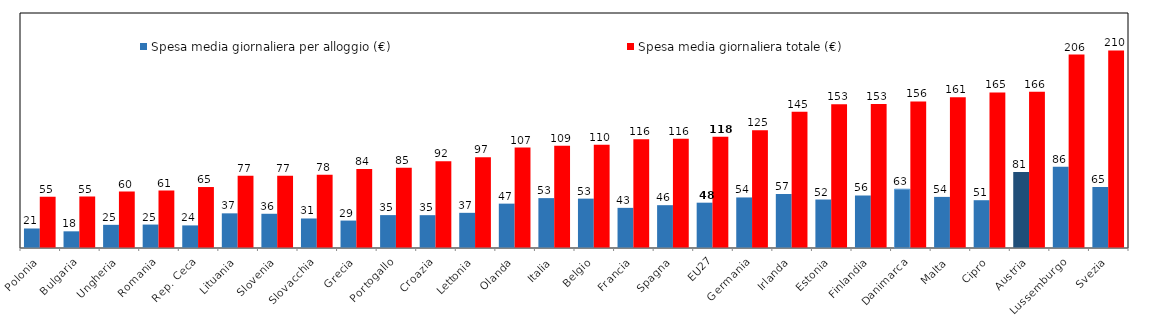
| Category | Spesa media giornaliera per alloggio (€) | Spesa media giornaliera totale (€) |
|---|---|---|
| Polonia | 20.76 | 54.585 |
| Bulgaria | 17.74 | 54.769 |
| Ungheria | 24.64 | 60.042 |
| Romania | 24.93 | 61.157 |
| Rep. Ceca | 24.04 | 64.861 |
| Lituania | 36.87 | 76.853 |
| Slovenia | 36.41 | 76.895 |
| Slovacchia | 31.41 | 77.911 |
| Grecia | 29.19 | 83.933 |
| Portogallo | 34.99 | 85.443 |
| Croazia | 34.92 | 92.37 |
| Lettonia | 37.42 | 96.539 |
| Olanda | 47.19 | 106.888 |
| Italia | 53.06 | 108.811 |
| Belgio | 52.53 | 109.759 |
| Francia | 42.7 | 115.58 |
| Spagna | 45.55 | 116.097 |
| EU27 | 48.21 | 118.257 |
| Germania | 53.78 | 125.324 |
| Irlanda | 57.4 | 144.983 |
| Estonia | 51.57 | 152.915 |
| Finlandia | 55.94 | 153.232 |
| Danimarca | 62.56 | 155.893 |
| Malta | 54.36 | 160.502 |
| Cipro | 50.84 | 165.476 |
| Austria | 80.72 | 166.338 |
| Lussemburgo | 86.37 | 205.836 |
| Svezia | 64.95 | 210.204 |